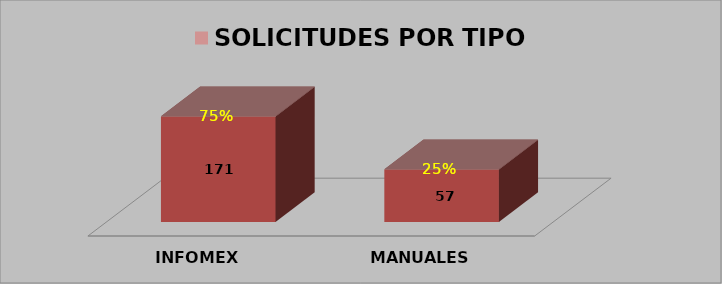
| Category | SOLICITUDES POR TIPO #¡REF! #¡REF! #¡REF! |
|---|---|
| INFOMEX | 0.666 |
| MANUALES | 0.331 |